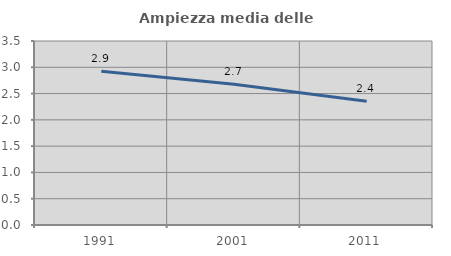
| Category | Ampiezza media delle famiglie |
|---|---|
| 1991.0 | 2.925 |
| 2001.0 | 2.675 |
| 2011.0 | 2.354 |